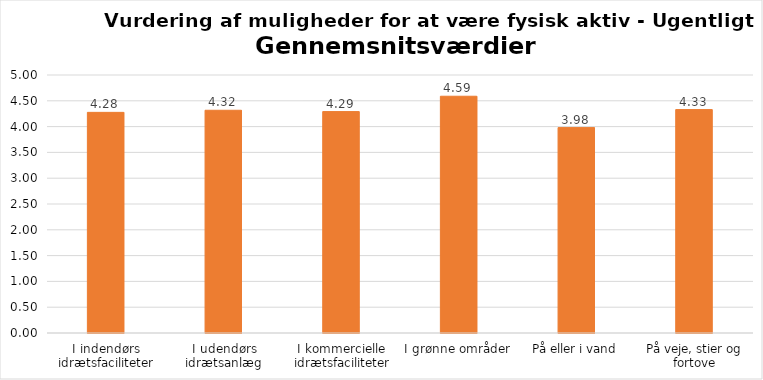
| Category | Gennemsnit |
|---|---|
| I indendørs idrætsfaciliteter | 4.276 |
| I udendørs idrætsanlæg | 4.317 |
| I kommercielle idrætsfaciliteter | 4.291 |
| I grønne områder | 4.588 |
| På eller i vand | 3.981 |
| På veje, stier og fortove | 4.33 |